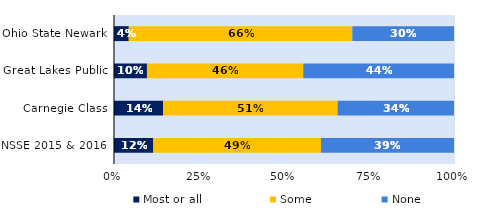
| Category | Most or all | Some | None |
|---|---|---|---|
| Ohio State Newark | 0.043 | 0.658 | 0.299 |
| Great Lakes Public | 0.097 | 0.46 | 0.443 |
| Carnegie Class | 0.145 | 0.513 | 0.342 |
| NSSE 2015 & 2016 | 0.116 | 0.493 | 0.391 |